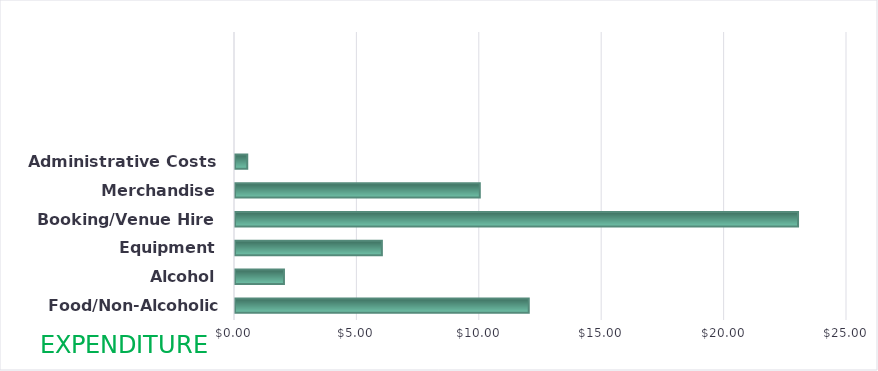
| Category | Amount |
|---|---|
| Food/Non-Alcoholic Drinks | 12 |
| Alcohol | 2 |
| Equipment | 6 |
| Booking/Venue Hire | 23 |
| Merchandise | 10 |
| Administrative Costs | 0.5 |